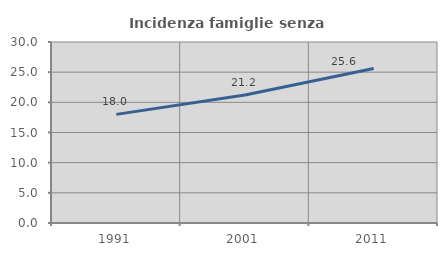
| Category | Incidenza famiglie senza nuclei |
|---|---|
| 1991.0 | 18.003 |
| 2001.0 | 21.212 |
| 2011.0 | 25.597 |